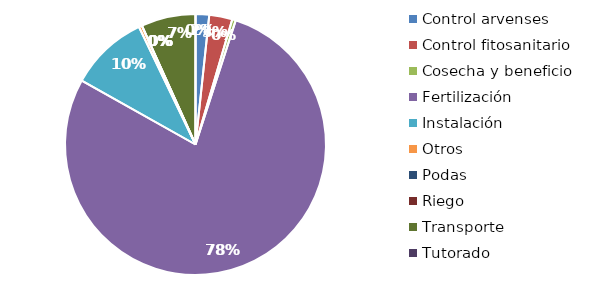
| Category | Valor |
|---|---|
| Control arvenses | 731220 |
| Control fitosanitario | 1240740 |
| Cosecha y beneficio | 189643.822 |
| Fertilización | 33867054 |
| Instalación | 4210639.707 |
| Otros | 169300 |
| Podas | 0 |
| Riego | 0 |
| Transporte | 2923666 |
| Tutorado | 0 |